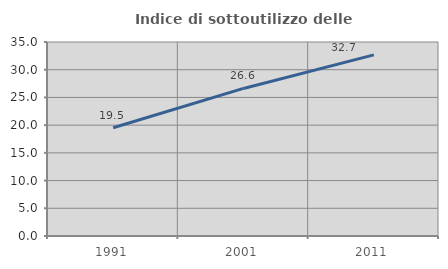
| Category | Indice di sottoutilizzo delle abitazioni  |
|---|---|
| 1991.0 | 19.529 |
| 2001.0 | 26.624 |
| 2011.0 | 32.685 |